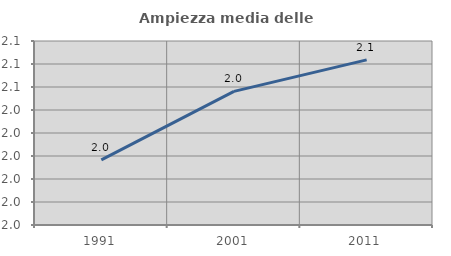
| Category | Ampiezza media delle famiglie |
|---|---|
| 1991.0 | 2.018 |
| 2001.0 | 2.048 |
| 2011.0 | 2.062 |